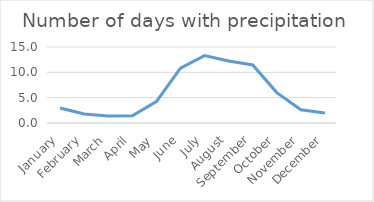
| Category | Series 0 |
|---|---|
| January | 2.967 |
| February | 1.767 |
| March | 1.367 |
| April | 1.433 |
| May | 4.233 |
| June | 10.833 |
| July | 13.3 |
| August | 12.233 |
| September | 11.467 |
| October | 6 |
| November | 2.6 |
| December | 1.967 |